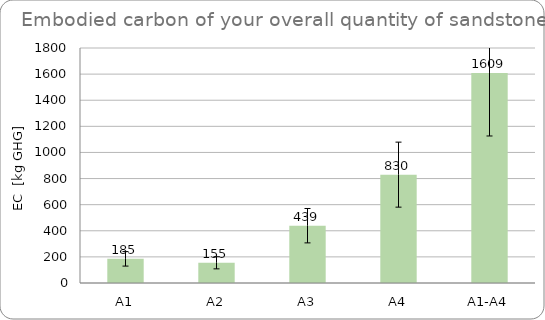
| Category | Series 0 |
|---|---|
| A1 | 185 |
| A2 | 154.8 |
| A3 | 439 |
| A4 | 830 |
| A1-A4 | 1608.8 |